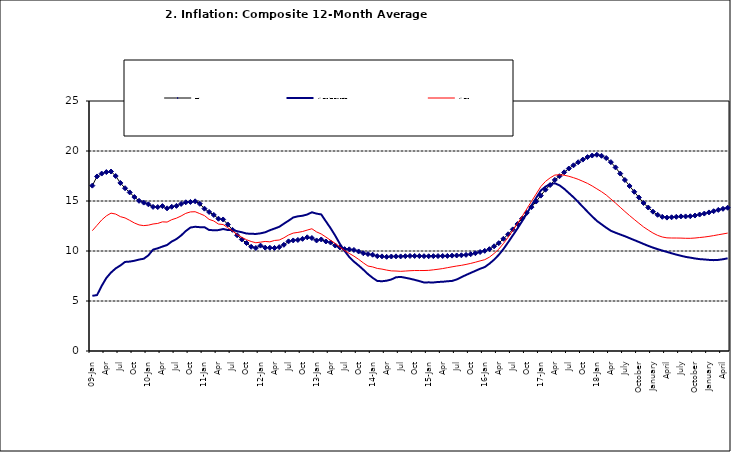
| Category | Food | All Items less Farm Produce | All Items |
|---|---|---|---|
| 09-Jan | 16.536 | 5.519 | 12.032 |
| Feb | 17.454 | 5.591 | 12.567 |
| Mar | 17.742 | 6.51 | 13.101 |
| Apr | 17.89 | 7.302 | 13.51 |
| May | 17.949 | 7.847 | 13.787 |
| June | 17.498 | 8.259 | 13.694 |
| Jul | 16.808 | 8.554 | 13.437 |
| Aug | 16.278 | 8.906 | 13.307 |
| Sep | 15.859 | 8.942 | 13.065 |
| Oct | 15.396 | 9.024 | 12.803 |
| Nov | 15.018 | 9.143 | 12.609 |
| Dec | 14.841 | 9.226 | 12.538 |
| 10-Jan | 14.668 | 9.567 | 12.586 |
| Feb | 14.411 | 10.138 | 12.7 |
| Mar | 14.395 | 10.269 | 12.757 |
| Apr | 14.489 | 10.444 | 12.915 |
| May | 14.266 | 10.597 | 12.893 |
| Jun | 14.424 | 10.948 | 13.132 |
| Jul | 14.514 | 11.193 | 13.284 |
| Aug | 14.706 | 11.549 | 13.5 |
| Sep | 14.872 | 11.997 | 13.764 |
| Oct | 14.906 | 12.345 | 13.908 |
| Nov | 14.967 | 12.423 | 13.928 |
| Dec | 14.723 | 12.383 | 13.74 |
| 11-Jan | 14.233 | 12.385 | 13.542 |
| Feb | 13.903 | 12.099 | 13.161 |
| Mar | 13.606 | 12.077 | 13.001 |
| Apr | 13.227 | 12.088 | 12.694 |
| May | 13.152 | 12.198 | 12.648 |
| Jun | 12.654 | 12.1 | 12.321 |
| Jul | 12.118 | 12.109 | 12.009 |
| Aug | 11.575 | 11.98 | 11.635 |
| Sep | 11.155 | 11.877 | 11.363 |
| Oct | 10.797 | 11.746 | 11.13 |
| Nov | 10.422 | 11.721 | 10.952 |
| Dec | 10.298 | 11.706 | 10.826 |
| 12-Jan | 10.538 | 11.765 | 10.886 |
| 12-Feb | 10.336 | 11.872 | 10.955 |
| 12-Mar | 10.325 | 12.075 | 10.914 |
| Apr | 10.304 | 12.242 | 11.054 |
| May | 10.387 | 12.419 | 11.096 |
| Jun | 10.617 | 12.732 | 11.32 |
| Jul | 10.963 | 13.032 | 11.599 |
| Aug | 11.056 | 13.349 | 11.791 |
| Sep | 11.104 | 13.467 | 11.859 |
| Oct | 11.216 | 13.525 | 11.948 |
| Nov | 11.372 | 13.649 | 12.091 |
| Dec | 11.296 | 13.873 | 12.224 |
| 13-Jan | 11.055 | 13.737 | 11.908 |
| Feb | 11.153 | 13.657 | 11.703 |
| Mar | 10.951 | 12.963 | 11.394 |
| Apr | 10.844 | 12.281 | 11.072 |
| May | 10.548 | 11.531 | 10.761 |
| Jun | 10.352 | 10.704 | 10.383 |
| Jul | 10.186 | 10.005 | 10.047 |
| Aug | 10.168 | 9.4 | 9.761 |
| Sep | 10.105 | 8.939 | 9.486 |
| Oct | 9.955 | 8.553 | 9.167 |
| Nov | 9.774 | 8.136 | 8.815 |
| Dec | 9.695 | 7.691 | 8.496 |
| 14-Jan | 9.626 | 7.317 | 8.408 |
| Feb | 9.484 | 7.005 | 8.257 |
| Mar | 9.464 | 6.976 | 8.19 |
| Apr | 9.416 | 7.03 | 8.092 |
| May | 9.448 | 7.151 | 8.012 |
| Jun | 9.464 | 7.369 | 7.998 |
| Jul | 9.459 | 7.411 | 7.968 |
| Aug | 9.481 | 7.325 | 7.996 |
| Sep | 9.501 | 7.228 | 8.027 |
| Oct | 9.508 | 7.116 | 8.047 |
| Nov | 9.492 | 6.991 | 8.046 |
| Dec | 9.481 | 6.854 | 8.047 |
| 15-Jan | 9.475 | 6.865 | 8.063 |
| Feb | 9.486 | 6.852 | 8.117 |
| Mar | 9.495 | 6.905 | 8.176 |
| Apr | 9.501 | 6.922 | 8.243 |
| May | 9.51 | 6.975 | 8.331 |
| Jun | 9.535 | 7.006 | 8.417 |
| Jul | 9.552 | 7.154 | 8.497 |
| Aug | 9.571 | 7.384 | 8.566 |
| Sep | 9.614 | 7.605 | 8.658 |
| Oct | 9.68 | 7.812 | 8.76 |
| Nov | 9.778 | 8.016 | 8.879 |
| Dec | 9.898 | 8.222 | 9.009 |
| 16-Jan | 10.017 | 8.391 | 9.13 |
| Feb | 10.184 | 8.732 | 9.386 |
| Mar | 10.471 | 9.132 | 9.751 |
| Apr | 10.786 | 9.614 | 10.182 |
| May | 11.221 | 10.196 | 10.746 |
| Jun | 11.672 | 10.864 | 11.372 |
| Jul | 12.162 | 11.553 | 12.045 |
| Aug | 12.696 | 12.247 | 12.744 |
| Sep | 13.238 | 12.98 | 13.454 |
| Oct | 13.817 | 13.757 | 14.206 |
| Nov | 14.386 | 14.542 | 14.958 |
| Dec | 14.946 | 15.307 | 15.697 |
| 17-Jan | 15.536 | 16.042 | 16.441 |
| Feb | 16.127 | 16.436 | 16.958 |
| Mar | 16.598 | 16.682 | 17.315 |
| Apr | 17.106 | 16.772 | 17.591 |
| May | 17.477 | 16.567 | 17.628 |
| Jun | 17.868 | 16.219 | 17.578 |
| Jul | 18.247 | 15.798 | 17.475 |
| Aug | 18.569 | 15.372 | 17.331 |
| Sep | 18.876 | 14.903 | 17.17 |
| Oct | 19.14 | 14.415 | 16.968 |
| Nov | 19.392 | 13.93 | 16.76 |
| Dec | 19.546 | 13.458 | 16.502 |
| 18-Jan | 19.621 | 13.01 | 16.215 |
| Feb | 19.521 | 12.668 | 15.93 |
| Mar | 19.294 | 12.33 | 15.599 |
| Apr | 18.886 | 12.021 | 15.196 |
| May | 18.359 | 11.828 | 14.793 |
| June | 17.745 | 11.651 | 14.371 |
| July | 17.102 | 11.478 | 13.95 |
| August | 16.501 | 11.285 | 13.546 |
| September | 15.923 | 11.092 | 13.157 |
| October | 15.355 | 10.903 | 12.777 |
| November | 14.802 | 10.703 | 12.406 |
| December | 14.348 | 10.514 | 12.095 |
| January | 13.934 | 10.339 | 11.801 |
| February | 13.62 | 10.185 | 11.564 |
| March | 13.42 | 10.044 | 11.401 |
| April | 13.339 | 9.909 | 11.314 |
| May | 13.371 | 9.77 | 11.299 |
| June | 13.418 | 9.64 | 11.297 |
| July | 13.46 | 9.524 | 11.291 |
| August | 13.458 | 9.411 | 11.271 |
| September | 13.474 | 9.337 | 11.268 |
| October | 13.544 | 9.253 | 11.298 |
| November | 13.646 | 9.189 | 11.348 |
| December | 13.743 | 9.155 | 11.396 |
| January | 13.859 | 9.112 | 11.462 |
| February | 13.98 | 9.086 | 11.539 |
| March | 14.109 | 9.112 | 11.624 |
| April | 14.221 | 9.174 | 11.706 |
| May | 14.325 | 9.267 | 11.791 |